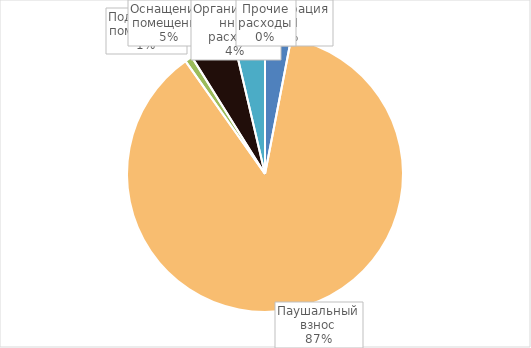
| Category | Series 0 |
|---|---|
| Регистрация ИП | 17400 |
| Паушальный взнос | 500000 |
| Подготовка помещения | 5000 |
| Оснащение  помещений | 30000 |
| Организационные расходы | 21000 |
| Прочие расходы | 0 |